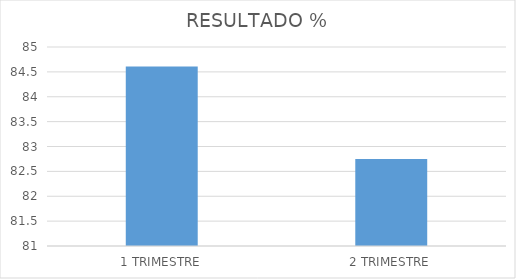
| Category | RESULTADO % |
|---|---|
| 1 TRIMESTRE | 84.61 |
| 2 TRIMESTRE | 82.75 |